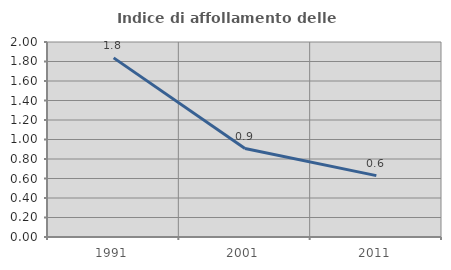
| Category | Indice di affollamento delle abitazioni  |
|---|---|
| 1991.0 | 1.837 |
| 2001.0 | 0.907 |
| 2011.0 | 0.629 |